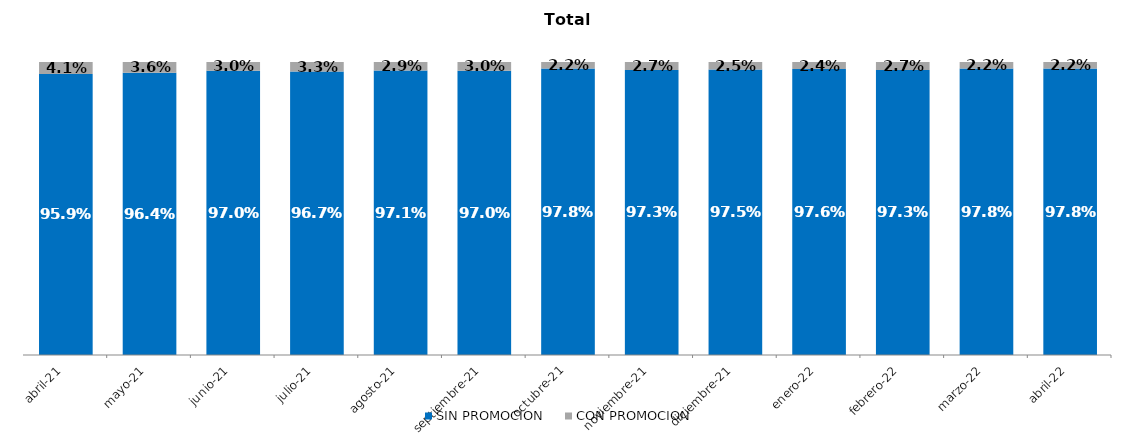
| Category | SIN PROMOCION   | CON PROMOCION   |
|---|---|---|
| 2021-04-01 | 0.959 | 0.041 |
| 2021-05-01 | 0.964 | 0.036 |
| 2021-06-01 | 0.97 | 0.03 |
| 2021-07-01 | 0.967 | 0.033 |
| 2021-08-01 | 0.971 | 0.029 |
| 2021-09-01 | 0.97 | 0.03 |
| 2021-10-01 | 0.978 | 0.022 |
| 2021-11-01 | 0.973 | 0.027 |
| 2021-12-01 | 0.975 | 0.025 |
| 2022-01-01 | 0.976 | 0.024 |
| 2022-02-01 | 0.973 | 0.027 |
| 2022-03-01 | 0.978 | 0.022 |
| 2022-04-01 | 0.978 | 0.022 |